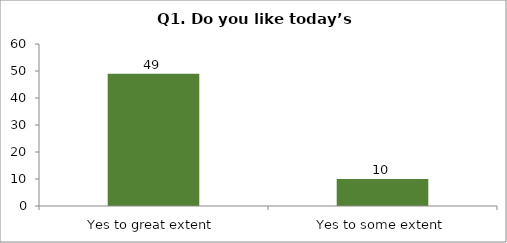
| Category | Q1. Do you like today’s session? |
|---|---|
| Yes to great extent | 49 |
| Yes to some extent | 10 |